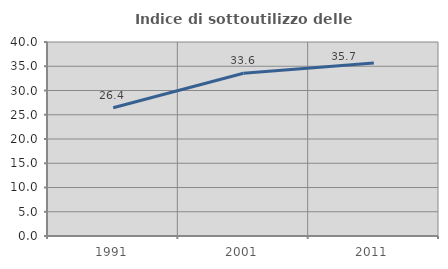
| Category | Indice di sottoutilizzo delle abitazioni  |
|---|---|
| 1991.0 | 26.43 |
| 2001.0 | 33.57 |
| 2011.0 | 35.656 |